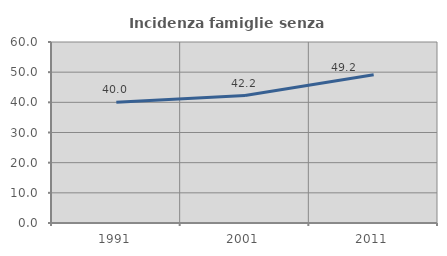
| Category | Incidenza famiglie senza nuclei |
|---|---|
| 1991.0 | 40 |
| 2001.0 | 42.243 |
| 2011.0 | 49.161 |